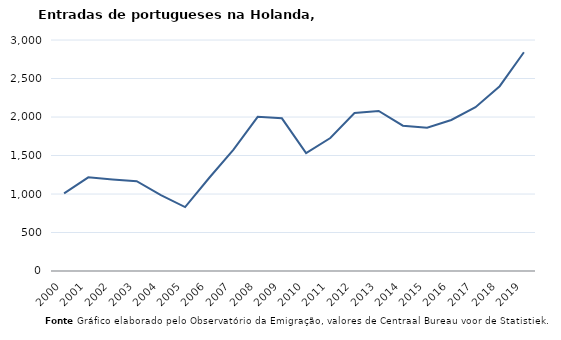
| Category | Entradas |
|---|---|
| 2000.0 | 1009 |
| 2001.0 | 1216 |
| 2002.0 | 1189 |
| 2003.0 | 1166 |
| 2004.0 | 984 |
| 2005.0 | 830 |
| 2006.0 | 1211 |
| 2007.0 | 1577 |
| 2008.0 | 2002 |
| 2009.0 | 1983 |
| 2010.0 | 1530 |
| 2011.0 | 1727 |
| 2012.0 | 2051 |
| 2013.0 | 2079 |
| 2014.0 | 1887 |
| 2015.0 | 1860 |
| 2016.0 | 1961 |
| 2017.0 | 2127 |
| 2018.0 | 2400 |
| 2019.0 | 2841 |